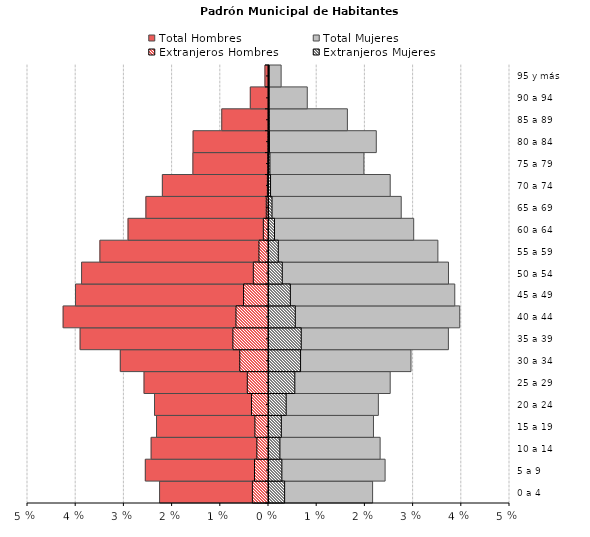
| Category | Total Hombres | Total Mujeres | Extranjeros Hombres | Extranjeros Mujeres |
|---|---|---|---|---|
| 0 a 4 | -0.023 | 0.021 | -0.003 | 0.003 |
| 5 a 9 | -0.026 | 0.024 | -0.003 | 0.003 |
| 10 a 14 | -0.024 | 0.023 | -0.002 | 0.002 |
| 15 a 19 | -0.023 | 0.022 | -0.003 | 0.003 |
| 20 a 24 | -0.024 | 0.023 | -0.004 | 0.004 |
| 25 a 29 | -0.026 | 0.025 | -0.004 | 0.005 |
| 30 a 34 | -0.031 | 0.029 | -0.006 | 0.007 |
| 35 a 39 | -0.039 | 0.037 | -0.007 | 0.007 |
| 40 a 44 | -0.043 | 0.04 | -0.007 | 0.005 |
| 45 a 49 | -0.04 | 0.039 | -0.005 | 0.004 |
| 50 a 54 | -0.039 | 0.037 | -0.003 | 0.003 |
| 55 a 59 | -0.035 | 0.035 | -0.002 | 0.002 |
| 60 a 64 | -0.029 | 0.03 | -0.001 | 0.001 |
| 65 a 69 | -0.025 | 0.027 | 0 | 0.001 |
| 70 a 74 | -0.022 | 0.025 | 0 | 0 |
| 75 a 79 | -0.016 | 0.02 | 0 | 0 |
| 80 a 84 | -0.016 | 0.022 | 0 | 0 |
| 85 a 89 | -0.01 | 0.016 | 0 | 0 |
| 90 a 94 | -0.004 | 0.008 | 0 | 0 |
| 95 y más | -0.001 | 0.003 | 0 | 0 |